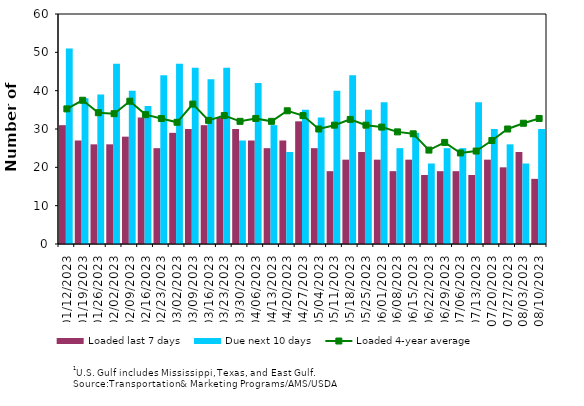
| Category | Loaded last 7 days | Due next 10 days |
|---|---|---|
| 01/12/2023 | 31 | 51 |
| 01/19/2023 | 27 | 38 |
| 01/26/2023 | 26 | 39 |
| 02/02/2023 | 26 | 47 |
| 02/09/2023 | 28 | 40 |
| 02/16/2023 | 33 | 36 |
| 02/23/2023 | 25 | 44 |
| 03/02/2023 | 29 | 47 |
| 03/09/2023 | 30 | 46 |
| 03/16/2023 | 31 | 43 |
| 03/23/2023 | 33 | 46 |
| 03/30/2023 | 30 | 27 |
| 04/06/2023 | 27 | 42 |
| 04/13/2023 | 25 | 31 |
| 04/20/2023 | 27 | 24 |
| 04/27/2023 | 32 | 35 |
| 05/04/2023 | 25 | 33 |
| 05/11/2023 | 19 | 40 |
| 05/18/2023 | 22 | 44 |
| 05/25/2023 | 24 | 35 |
| 06/01/2023 | 22 | 37 |
| 06/08/2023 | 19 | 25 |
| 06/15/2023 | 22 | 29 |
| 06/22/2023 | 18 | 21 |
| 06/29/2023 | 19 | 25 |
| 07/06/2023 | 19 | 25 |
| 07/13/2023 | 18 | 37 |
| 07/20/2023 | 22 | 30 |
| 07/27/2023 | 20 | 26 |
| 08/03/2023 | 24 | 21 |
| 08/10/2023 | 17 | 30 |